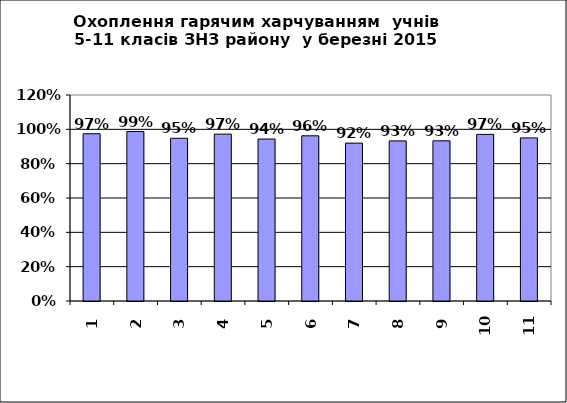
| Category | Series 0 |
|---|---|
| 0 | 0.974 |
| 1 | 0.987 |
| 2 | 0.948 |
| 3 | 0.972 |
| 4 | 0.944 |
| 5 | 0.962 |
| 6 | 0.92 |
| 7 | 0.933 |
| 8 | 0.933 |
| 9 | 0.971 |
| 10 | 0.95 |